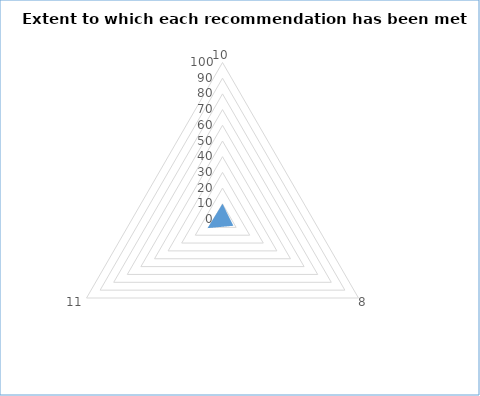
| Category | Series 0 | Series 1 |
|---|---|---|
| 10.0 | 10 | 0 |
| 8.0 | 8 | 0 |
| 11.0 | 11 | 0 |